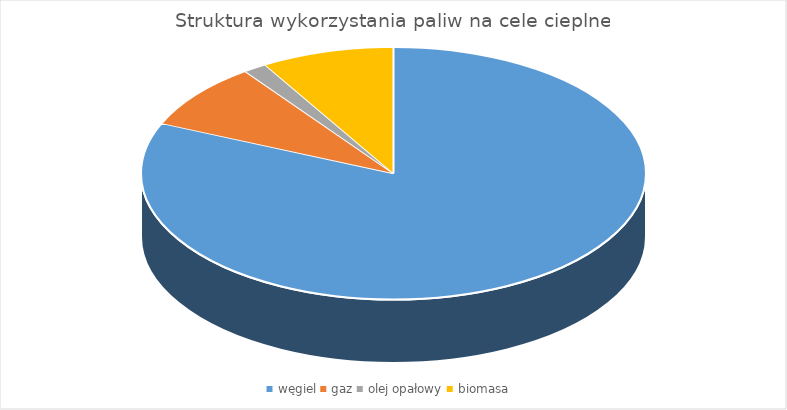
| Category | Series 0 |
|---|---|
| węgiel | 0.815 |
| gaz | 0.085 |
| olej opałowy | 0.015 |
| biomasa | 0.085 |